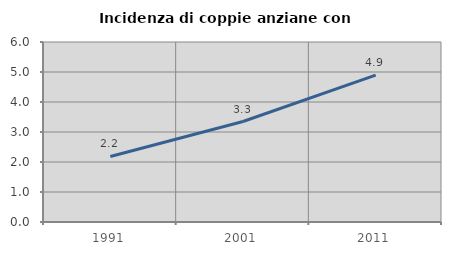
| Category | Incidenza di coppie anziane con figli |
|---|---|
| 1991.0 | 2.185 |
| 2001.0 | 3.35 |
| 2011.0 | 4.897 |